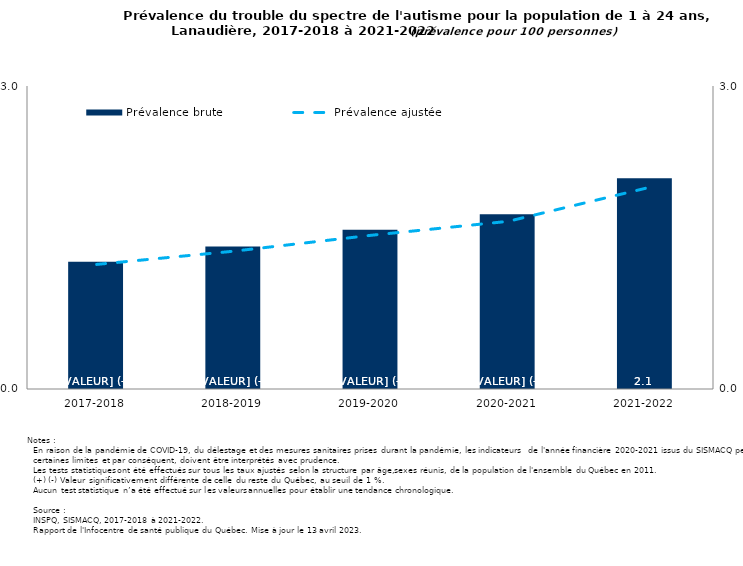
| Category | Prévalence brute |
|---|---|
| 2017-2018 | 1.26 |
| 2018-2019 | 1.411 |
| 2019-2020 | 1.577 |
| 2020-2021 | 1.731 |
| 2021-2022 | 2.086 |